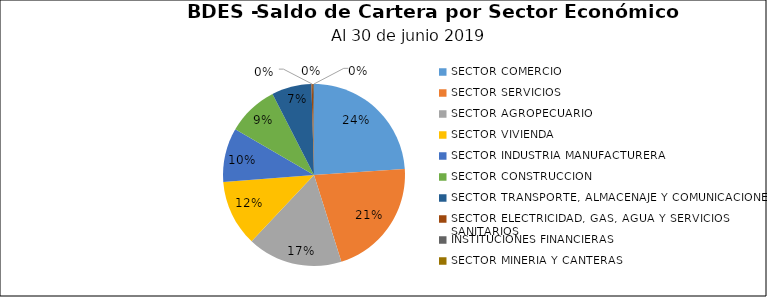
| Category | Saldo | Créditos |
|---|---|---|
| SECTOR COMERCIO | 95.388 | 5055 |
| SECTOR SERVICIOS | 84.502 | 4177 |
| SECTOR AGROPECUARIO | 67.324 | 2195 |
| SECTOR VIVIENDA | 46.84 | 2656 |
| SECTOR INDUSTRIA MANUFACTURERA | 38.214 | 725 |
| SECTOR CONSTRUCCION | 36.256 | 2761 |
| SECTOR TRANSPORTE, ALMACENAJE Y COMUNICACIONES | 28.229 | 1180 |
| SECTOR ELECTRICIDAD, GAS, AGUA Y SERVICIOS SANITARIOS | 1.004 | 11 |
| INSTITUCIONES FINANCIERAS | 0.734 | 3 |
| SECTOR MINERIA Y CANTERAS | 0.07 | 6 |